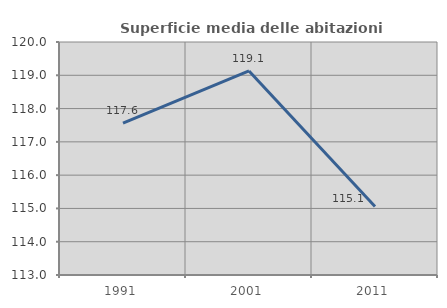
| Category | Superficie media delle abitazioni occupate |
|---|---|
| 1991.0 | 117.561 |
| 2001.0 | 119.13 |
| 2011.0 | 115.059 |